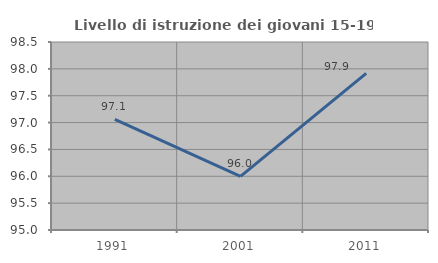
| Category | Livello di istruzione dei giovani 15-19 anni |
|---|---|
| 1991.0 | 97.059 |
| 2001.0 | 96 |
| 2011.0 | 97.917 |